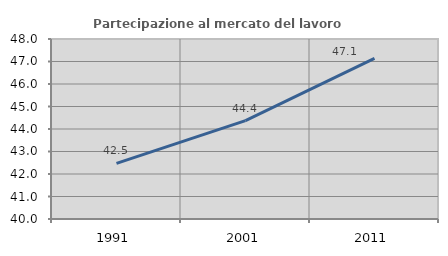
| Category | Partecipazione al mercato del lavoro  femminile |
|---|---|
| 1991.0 | 42.475 |
| 2001.0 | 44.374 |
| 2011.0 | 47.136 |